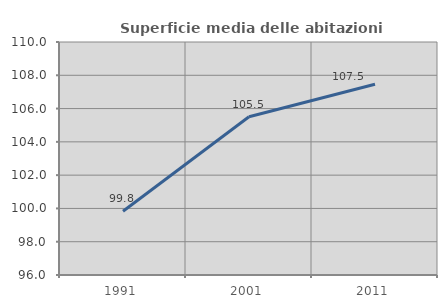
| Category | Superficie media delle abitazioni occupate |
|---|---|
| 1991.0 | 99.826 |
| 2001.0 | 105.511 |
| 2011.0 | 107.457 |